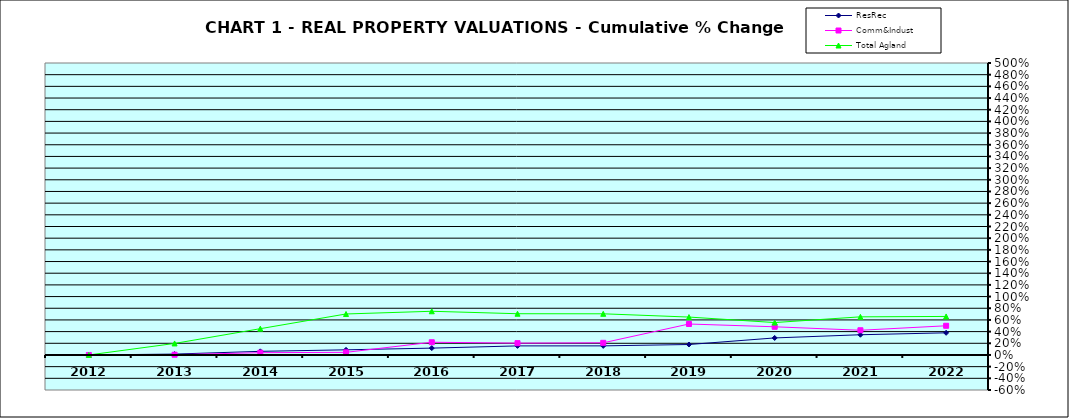
| Category | ResRec | Comm&Indust | Total Agland |
|---|---|---|---|
| 2012.0 | 0 | 0 | 0 |
| 2013.0 | 0.015 | 0.004 | 0.197 |
| 2014.0 | 0.062 | 0.039 | 0.45 |
| 2015.0 | 0.088 | 0.045 | 0.702 |
| 2016.0 | 0.117 | 0.218 | 0.748 |
| 2017.0 | 0.155 | 0.202 | 0.706 |
| 2018.0 | 0.156 | 0.208 | 0.705 |
| 2019.0 | 0.179 | 0.53 | 0.649 |
| 2020.0 | 0.292 | 0.483 | 0.555 |
| 2021.0 | 0.346 | 0.423 | 0.653 |
| 2022.0 | 0.379 | 0.5 | 0.66 |